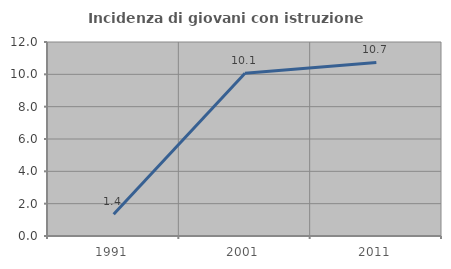
| Category | Incidenza di giovani con istruzione universitaria |
|---|---|
| 1991.0 | 1.351 |
| 2001.0 | 10.072 |
| 2011.0 | 10.734 |